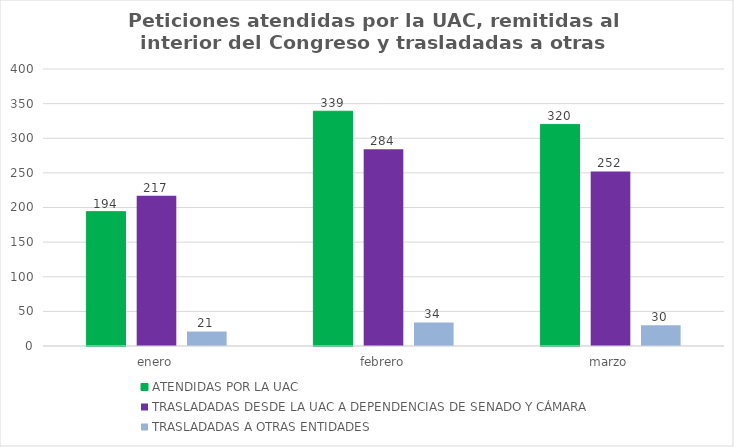
| Category | ATENDIDAS POR LA UAC  | TRASLADADAS DESDE LA UAC A DEPENDENCIAS DE SENADO Y CÁMARA | TRASLADADAS A OTRAS ENTIDADES |
|---|---|---|---|
| enero | 194 | 217 | 21 |
| febrero | 339 | 284 | 34 |
| marzo | 320 | 252 | 30 |